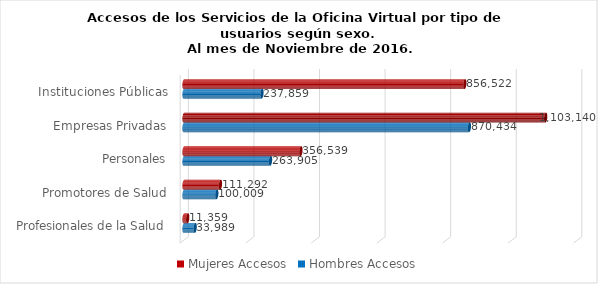
| Category | Mujeres | Hombres |
|---|---|---|
| Instituciones Públicas | 856522 | 237859 |
| Empresas Privadas | 1103140 | 870434 |
| Personales | 356539 | 263905 |
| Promotores de Salud | 111292 | 100009 |
| Profesionales de la Salud | 11359 | 33989 |